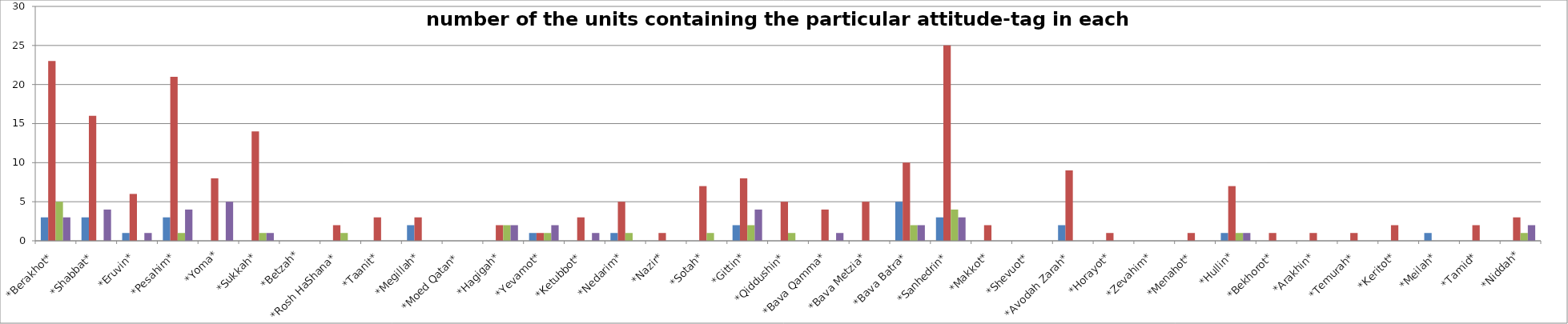
| Category | Series 0 | Series 1 | Series 2 | Series 3 |
|---|---|---|---|---|
| *Berakhot* | 3 | 23 | 5 | 3 |
| *Shabbat* | 3 | 16 | 0 | 4 |
| *Eruvin* | 1 | 6 | 0 | 1 |
| *Pesahim* | 3 | 21 | 1 | 4 |
| *Yoma* | 0 | 8 | 0 | 5 |
| *Sukkah* | 0 | 14 | 1 | 1 |
| *Betzah* | 0 | 0 | 0 | 0 |
| *Rosh HaShana* | 0 | 2 | 1 | 0 |
| *Taanit* | 0 | 3 | 0 | 0 |
| *Megillah* | 2 | 3 | 0 | 0 |
| *Moed Qatan* | 0 | 0 | 0 | 0 |
| *Hagigah* | 0 | 2 | 2 | 2 |
| *Yevamot* | 1 | 1 | 1 | 2 |
| *Ketubbot* | 0 | 3 | 0 | 1 |
| *Nedarim* | 1 | 5 | 1 | 0 |
| *Nazir* | 0 | 1 | 0 | 0 |
| *Sotah* | 0 | 7 | 1 | 0 |
| *Gittin* | 2 | 8 | 2 | 4 |
| *Qiddushin* | 0 | 5 | 1 | 0 |
| *Bava Qamma* | 0 | 4 | 0 | 1 |
| *Bava Metzia* | 0 | 5 | 0 | 0 |
| *Bava Batra* | 5 | 10 | 2 | 2 |
| *Sanhedrin* | 3 | 25 | 4 | 3 |
| *Makkot* | 0 | 2 | 0 | 0 |
| *Shevuot* | 0 | 0 | 0 | 0 |
| *Avodah Zarah* | 2 | 9 | 0 | 0 |
| *Horayot* | 0 | 1 | 0 | 0 |
| *Zevahim* | 0 | 0 | 0 | 0 |
| *Menahot* | 0 | 1 | 0 | 0 |
| *Hullin* | 1 | 7 | 1 | 1 |
| *Bekhorot* | 0 | 1 | 0 | 0 |
| *Arakhin* | 0 | 1 | 0 | 0 |
| *Temurah* | 0 | 1 | 0 | 0 |
| *Keritot* | 0 | 2 | 0 | 0 |
| *Meilah* | 1 | 0 | 0 | 0 |
| *Tamid* | 0 | 2 | 0 | 0 |
| *Niddah* | 0 | 3 | 1 | 2 |